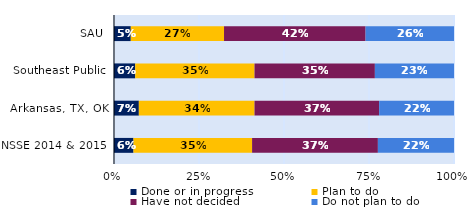
| Category | Done or in progress | Plan to do | Have not decided | Do not plan to do |
|---|---|---|---|---|
| SAU | 0.049 | 0.274 | 0.416 | 0.26 |
| Southeast Public | 0.062 | 0.351 | 0.354 | 0.233 |
| Arkansas, TX, OK | 0.073 | 0.34 | 0.367 | 0.22 |
| NSSE 2014 & 2015 | 0.057 | 0.349 | 0.37 | 0.224 |